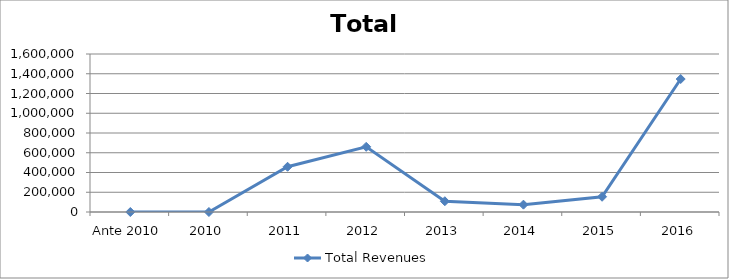
| Category | Total Revenues |
|---|---|
| Ante 2010 | 0 |
| 2010 | 0 |
| 2011 | 458000 |
| 2012 | 660000 |
| 2013 | 109037 |
| 2014 | 74230 |
| 2015 | 154427 |
| 2016 | 1346430.36 |